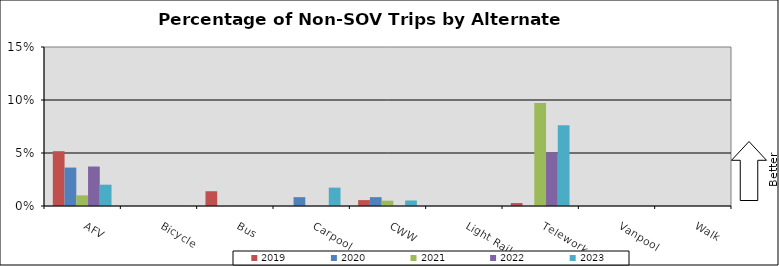
| Category | 2019 | 2020 | 2021 | 2022 | 2023 |
|---|---|---|---|---|---|
| AFV | 0.052 | 0.036 | 0.01 | 0.037 | 0.02 |
| Bicycle | 0 | 0 | 0 | 0 | 0 |
| Bus | 0.014 | 0 | 0 | 0 | 0 |
| Carpool | 0 | 0.008 | 0 | 0 | 0.017 |
| CWW | 0.006 | 0.008 | 0.005 | 0 | 0.005 |
| Light Rail | 0 | 0 | 0 | 0 | 0 |
| Telework | 0.003 | 0 | 0.097 | 0.05 | 0.076 |
| Vanpool | 0 | 0 | 0 | 0 | 0 |
| Walk | 0 | 0 | 0 | 0 | 0 |